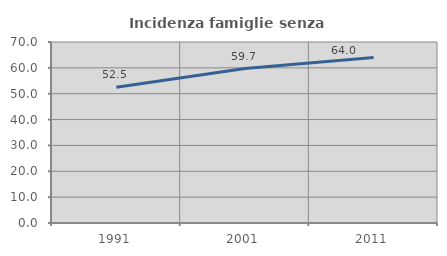
| Category | Incidenza famiglie senza nuclei |
|---|---|
| 1991.0 | 52.5 |
| 2001.0 | 59.714 |
| 2011.0 | 64.012 |